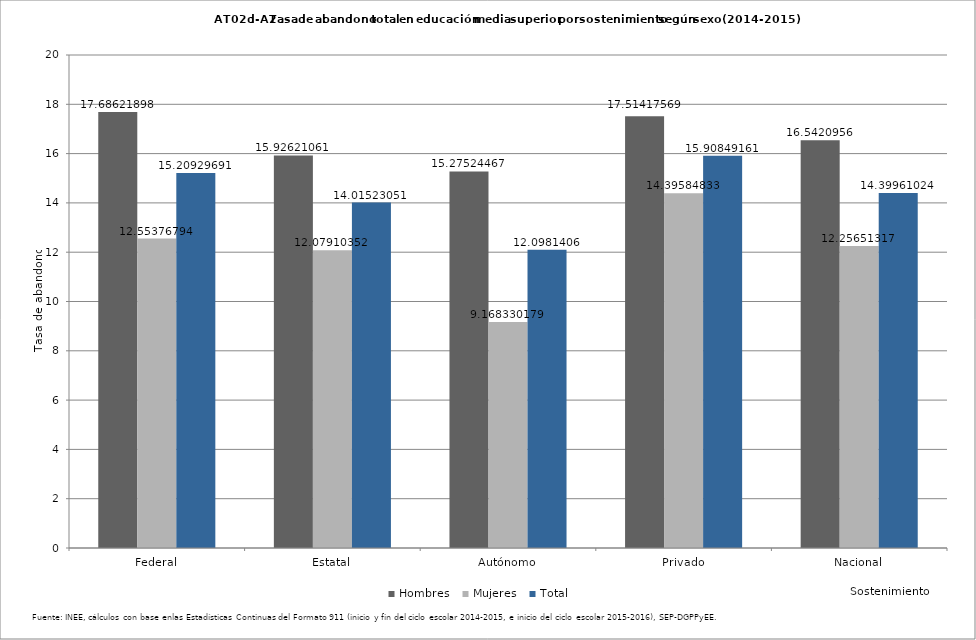
| Category | Hombres | Mujeres | Total |
|---|---|---|---|
| Federal | 17.686 | 12.554 | 15.209 |
| Estatal | 15.926 | 12.079 | 14.015 |
| Autónomo | 15.275 | 9.168 | 12.098 |
| Privado | 17.514 | 14.396 | 15.908 |
| Nacional | 16.542 | 12.257 | 14.4 |